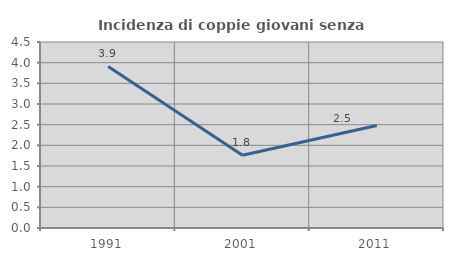
| Category | Incidenza di coppie giovani senza figli |
|---|---|
| 1991.0 | 3.908 |
| 2001.0 | 1.76 |
| 2011.0 | 2.478 |